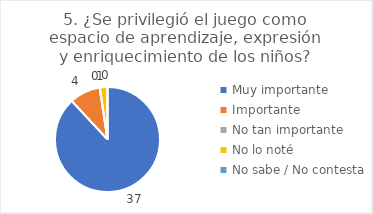
| Category | 5. ¿Se privilegió el juego como espacio de aprendizaje, expresión y enriquecimiento de los niños? |
|---|---|
| Muy importante  | 0.881 |
| Importante  | 0.095 |
| No tan importante  | 0 |
| No lo noté  | 0.024 |
| No sabe / No contesta | 0 |